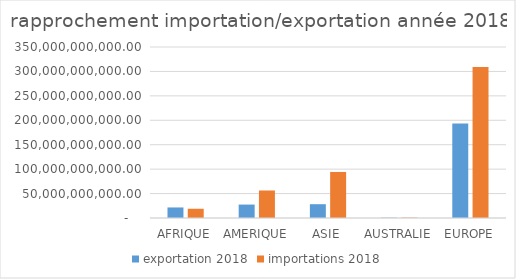
| Category | exportation 2018 | importations 2018 |
|---|---|---|
| AFRIQUE | 21593823389.755 | 18918911922.594 |
| AMERIQUE | 27487162903.315 | 56316437272.718 |
| ASIE | 28251767958.214 | 94229291213.244 |
| AUSTRALIE | 633506516.396 | 725933834.294 |
| EUROPE | 193224276111.15 | 309240247034.98 |